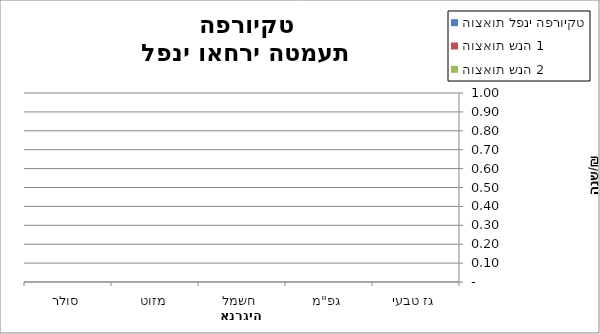
| Category | הוצאות לפני הפרויקט | הוצאות שנה 1 | הוצאות שנה 2 |
|---|---|---|---|
| גז טבעי | 0 | 0 | 0 |
| גפ"מ | 0 | 0 | 0 |
| חשמל | 0 | 0 | 0 |
| מזוט | 0 | 0 | 0 |
| סולר | 0 | 0 | 0 |